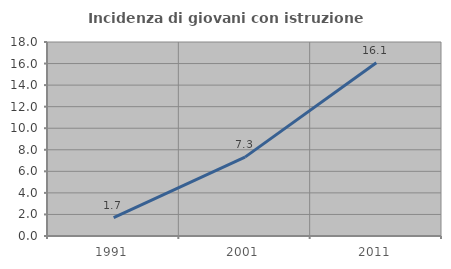
| Category | Incidenza di giovani con istruzione universitaria |
|---|---|
| 1991.0 | 1.714 |
| 2001.0 | 7.317 |
| 2011.0 | 16.078 |